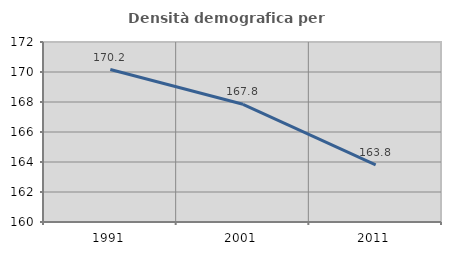
| Category | Densità demografica |
|---|---|
| 1991.0 | 170.165 |
| 2001.0 | 167.846 |
| 2011.0 | 163.812 |